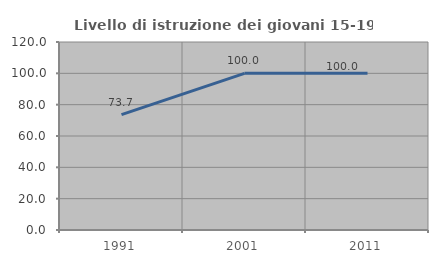
| Category | Livello di istruzione dei giovani 15-19 anni |
|---|---|
| 1991.0 | 73.684 |
| 2001.0 | 100 |
| 2011.0 | 100 |